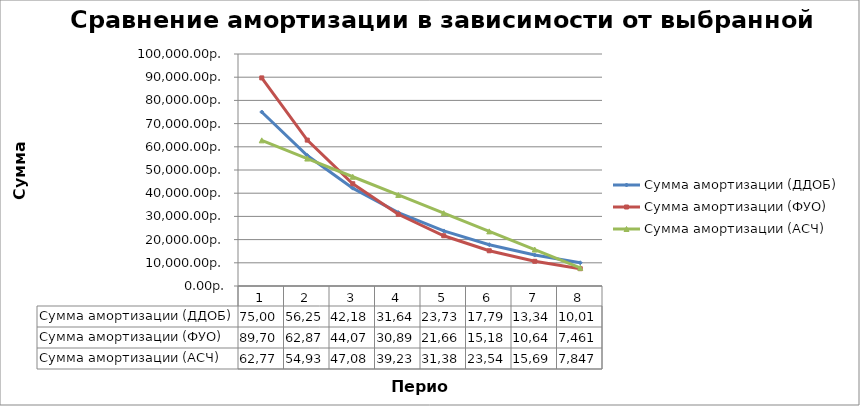
| Category | Сумма амортизации (ДДОБ) | Сумма амортизации (ФУО) | Сумма амортизации (АСЧ) |
|---|---|---|---|
| 0 | 75000 | 89700 | 62777.778 |
| 1 | 56250 | 62879.7 | 54930.556 |
| 2 | 42187.5 | 44078.67 | 47083.333 |
| 3 | 31640.625 | 30899.147 | 39236.111 |
| 4 | 23730.469 | 21660.302 | 31388.889 |
| 5 | 17797.852 | 15183.872 | 23541.667 |
| 6 | 13348.389 | 10643.894 | 15694.444 |
| 7 | 10011.292 | 7461.37 | 7847.222 |